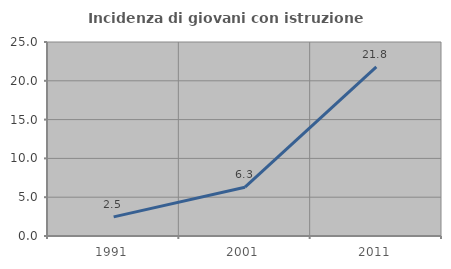
| Category | Incidenza di giovani con istruzione universitaria |
|---|---|
| 1991.0 | 2.469 |
| 2001.0 | 6.289 |
| 2011.0 | 21.807 |